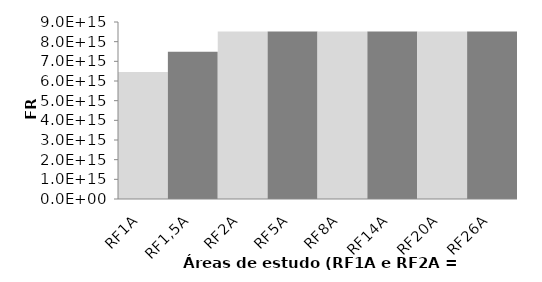
| Category | Series 0 |
|---|---|
| RF1A | 6462721874098498 |
| RF1,5A | 7490084584772654 |
| RF2A | 8517447295446812 |
| RF5A | 8517447295446812 |
| RF8A | 8517447295446812 |
| RF14A | 8517447295446812 |
| RF20A | 8517447295446812 |
| RF26A | 8517447295446812 |